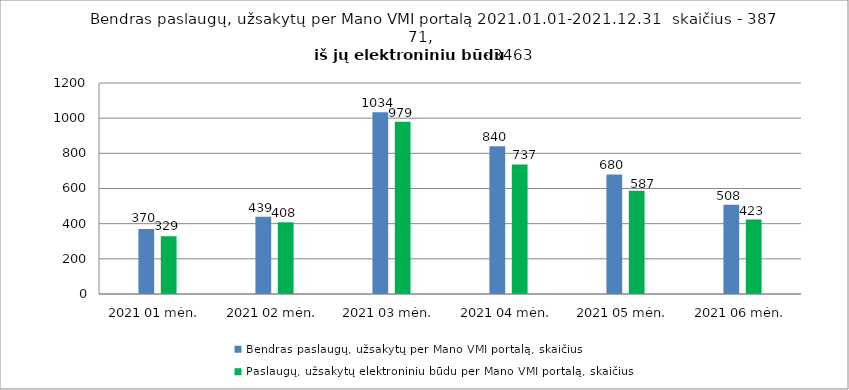
| Category | Bendras paslaugų, užsakytų per Mano VMI portalą, skaičius | Paslaugų, užsakytų elektroniniu būdu per Mano VMI portalą, skaičius |
|---|---|---|
| 2021 01 mėn. | 370 | 329 |
| 2021 02 mėn. | 439 | 408 |
| 2021 03 mėn. | 1034 | 979 |
| 2021 04 mėn. | 840 | 737 |
| 2021 05 mėn. | 680 | 587 |
| 2021 06 mėn. | 508 | 423 |